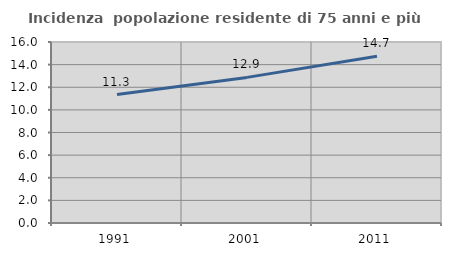
| Category | Incidenza  popolazione residente di 75 anni e più |
|---|---|
| 1991.0 | 11.349 |
| 2001.0 | 12.872 |
| 2011.0 | 14.741 |